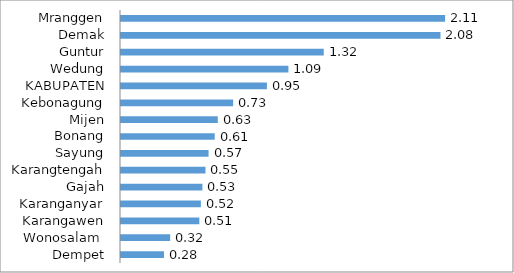
| Category | Series 0 |
|---|---|
| Dempet | 0.28 |
| Wonosalam  | 0.32 |
| Karangawen | 0.51 |
| Karanganyar | 0.52 |
| Gajah | 0.53 |
| Karangtengah | 0.55 |
| Sayung | 0.57 |
| Bonang | 0.61 |
| Mijen | 0.63 |
| Kebonagung | 0.73 |
| KABUPATEN | 0.95 |
| Wedung | 1.09 |
| Guntur | 1.32 |
| Demak | 2.08 |
| Mranggen | 2.11 |